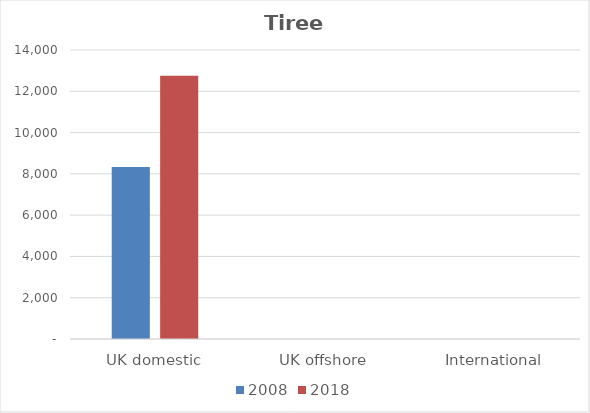
| Category | 2008 | 2018 |
|---|---|---|
| UK domestic | 8334 | 12754 |
| UK offshore | 0 | 0 |
| International | 0 | 0 |